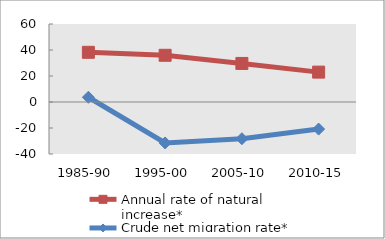
| Category | Annual rate of natural increase* | Crude net migration rate* |
|---|---|---|
| 1985-90 | 38.233 | 3.648 |
| 1995-00 | 35.937 | -31.514 |
| 2005-10 | 29.662 | -28.245 |
| 2010-15 | 22.982 | -20.838 |